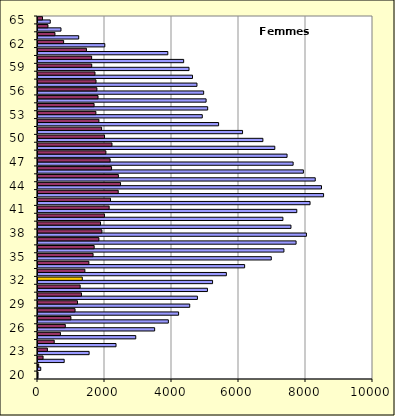
| Category | Femmes |
|---|---|
| 20 | 2 |
| 21 | 21 |
| 22 | 151 |
| 23 | 280 |
| 24 | 484 |
| 25 | 669 |
| 26 | 815 |
| 27 | 982 |
| 28 | 1106 |
| 29 | 1179 |
| 30 | 1298 |
| 31 | 1258 |
| 32 | 1322 |
| 33 | 1399 |
| 34 | 1519 |
| 35 | 1644 |
| 36 | 1677 |
| 37 | 1818 |
| 38 | 1908 |
| 39 | 1866 |
| 40 | 1983 |
| 41 | 2124 |
| 42 | 2164 |
| 43 | 2395 |
| 44 | 2464 |
| 45 | 2399 |
| 46 | 2196 |
| 47 | 2153 |
| 48 | 2027 |
| 49 | 2208 |
| 50 | 1986 |
| 51 | 1899 |
| 52 | 1818 |
| 53 | 1728 |
| 54 | 1674 |
| 55 | 1792 |
| 56 | 1758 |
| 57 | 1732 |
| 58 | 1701 |
| 59 | 1604 |
| 60 | 1601 |
| 61 | 1445 |
| 62 | 765 |
| 63 | 506 |
| 64 | 297 |
| 65 | 135 |